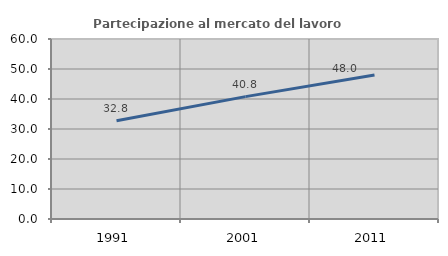
| Category | Partecipazione al mercato del lavoro  femminile |
|---|---|
| 1991.0 | 32.776 |
| 2001.0 | 40.791 |
| 2011.0 | 48 |